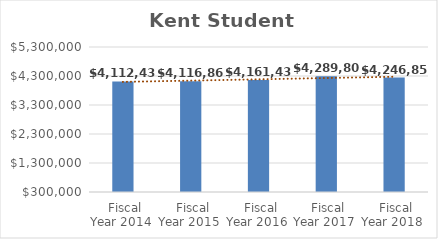
| Category | Kent Student Center  |
|---|---|
| Fiscal Year 2014 | 4112433 |
| Fiscal Year 2015 | 4116867 |
| Fiscal Year 2016 | 4161436 |
| Fiscal Year 2017 | 4289807 |
| Fiscal Year 2018 | 4246858.66 |